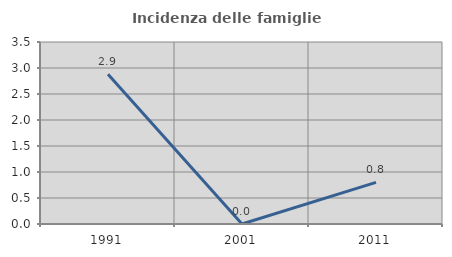
| Category | Incidenza delle famiglie numerose |
|---|---|
| 1991.0 | 2.878 |
| 2001.0 | 0 |
| 2011.0 | 0.8 |